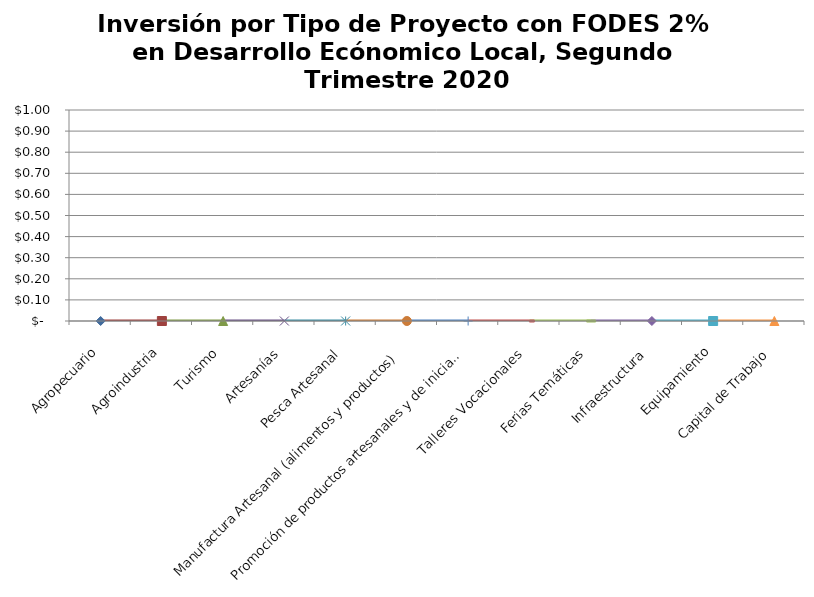
| Category | Series 0 |
|---|---|
| Agropecuario | 0 |
| Agroindustria | 0 |
| Turismo | 0 |
| Artesanías | 0 |
| Pesca Artesanal | 0 |
| Manufactura Artesanal (alimentos y productos) | 0 |
| Promoción de productos artesanales y de iniciativas económicas | 0 |
| Talleres Vocacionales | 0 |
| Ferias Temáticas | 0 |
| Infraestructura | 0 |
| Equipamiento | 0 |
| Capital de Trabajo | 0 |